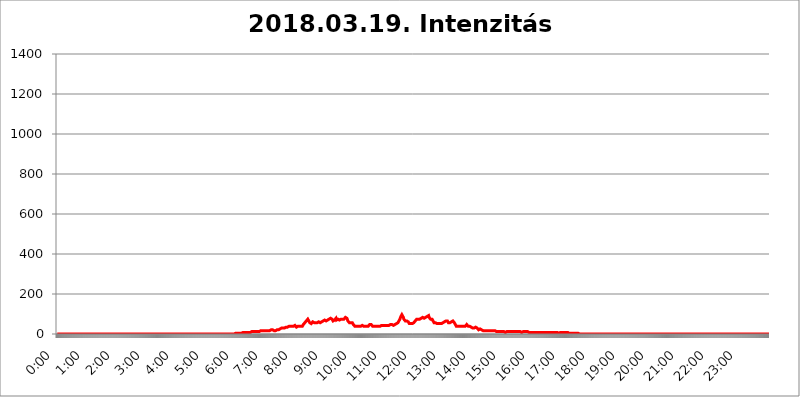
| Category | 2018.03.19. Intenzitás [W/m^2] |
|---|---|
| 0.0 | 0 |
| 0.0006944444444444445 | 0 |
| 0.001388888888888889 | 0 |
| 0.0020833333333333333 | 0 |
| 0.002777777777777778 | 0 |
| 0.003472222222222222 | 0 |
| 0.004166666666666667 | 0 |
| 0.004861111111111111 | 0 |
| 0.005555555555555556 | 0 |
| 0.0062499999999999995 | 0 |
| 0.006944444444444444 | 0 |
| 0.007638888888888889 | 0 |
| 0.008333333333333333 | 0 |
| 0.009027777777777779 | 0 |
| 0.009722222222222222 | 0 |
| 0.010416666666666666 | 0 |
| 0.011111111111111112 | 0 |
| 0.011805555555555555 | 0 |
| 0.012499999999999999 | 0 |
| 0.013194444444444444 | 0 |
| 0.013888888888888888 | 0 |
| 0.014583333333333332 | 0 |
| 0.015277777777777777 | 0 |
| 0.015972222222222224 | 0 |
| 0.016666666666666666 | 0 |
| 0.017361111111111112 | 0 |
| 0.018055555555555557 | 0 |
| 0.01875 | 0 |
| 0.019444444444444445 | 0 |
| 0.02013888888888889 | 0 |
| 0.020833333333333332 | 0 |
| 0.02152777777777778 | 0 |
| 0.022222222222222223 | 0 |
| 0.02291666666666667 | 0 |
| 0.02361111111111111 | 0 |
| 0.024305555555555556 | 0 |
| 0.024999999999999998 | 0 |
| 0.025694444444444447 | 0 |
| 0.02638888888888889 | 0 |
| 0.027083333333333334 | 0 |
| 0.027777777777777776 | 0 |
| 0.02847222222222222 | 0 |
| 0.029166666666666664 | 0 |
| 0.029861111111111113 | 0 |
| 0.030555555555555555 | 0 |
| 0.03125 | 0 |
| 0.03194444444444445 | 0 |
| 0.03263888888888889 | 0 |
| 0.03333333333333333 | 0 |
| 0.034027777777777775 | 0 |
| 0.034722222222222224 | 0 |
| 0.035416666666666666 | 0 |
| 0.036111111111111115 | 0 |
| 0.03680555555555556 | 0 |
| 0.0375 | 0 |
| 0.03819444444444444 | 0 |
| 0.03888888888888889 | 0 |
| 0.03958333333333333 | 0 |
| 0.04027777777777778 | 0 |
| 0.04097222222222222 | 0 |
| 0.041666666666666664 | 0 |
| 0.042361111111111106 | 0 |
| 0.04305555555555556 | 0 |
| 0.043750000000000004 | 0 |
| 0.044444444444444446 | 0 |
| 0.04513888888888889 | 0 |
| 0.04583333333333334 | 0 |
| 0.04652777777777778 | 0 |
| 0.04722222222222222 | 0 |
| 0.04791666666666666 | 0 |
| 0.04861111111111111 | 0 |
| 0.049305555555555554 | 0 |
| 0.049999999999999996 | 0 |
| 0.05069444444444445 | 0 |
| 0.051388888888888894 | 0 |
| 0.052083333333333336 | 0 |
| 0.05277777777777778 | 0 |
| 0.05347222222222222 | 0 |
| 0.05416666666666667 | 0 |
| 0.05486111111111111 | 0 |
| 0.05555555555555555 | 0 |
| 0.05625 | 0 |
| 0.05694444444444444 | 0 |
| 0.057638888888888885 | 0 |
| 0.05833333333333333 | 0 |
| 0.05902777777777778 | 0 |
| 0.059722222222222225 | 0 |
| 0.06041666666666667 | 0 |
| 0.061111111111111116 | 0 |
| 0.06180555555555556 | 0 |
| 0.0625 | 0 |
| 0.06319444444444444 | 0 |
| 0.06388888888888888 | 0 |
| 0.06458333333333334 | 0 |
| 0.06527777777777778 | 0 |
| 0.06597222222222222 | 0 |
| 0.06666666666666667 | 0 |
| 0.06736111111111111 | 0 |
| 0.06805555555555555 | 0 |
| 0.06874999999999999 | 0 |
| 0.06944444444444443 | 0 |
| 0.07013888888888889 | 0 |
| 0.07083333333333333 | 0 |
| 0.07152777777777779 | 0 |
| 0.07222222222222223 | 0 |
| 0.07291666666666667 | 0 |
| 0.07361111111111111 | 0 |
| 0.07430555555555556 | 0 |
| 0.075 | 0 |
| 0.07569444444444444 | 0 |
| 0.0763888888888889 | 0 |
| 0.07708333333333334 | 0 |
| 0.07777777777777778 | 0 |
| 0.07847222222222222 | 0 |
| 0.07916666666666666 | 0 |
| 0.0798611111111111 | 0 |
| 0.08055555555555556 | 0 |
| 0.08125 | 0 |
| 0.08194444444444444 | 0 |
| 0.08263888888888889 | 0 |
| 0.08333333333333333 | 0 |
| 0.08402777777777777 | 0 |
| 0.08472222222222221 | 0 |
| 0.08541666666666665 | 0 |
| 0.08611111111111112 | 0 |
| 0.08680555555555557 | 0 |
| 0.08750000000000001 | 0 |
| 0.08819444444444445 | 0 |
| 0.08888888888888889 | 0 |
| 0.08958333333333333 | 0 |
| 0.09027777777777778 | 0 |
| 0.09097222222222222 | 0 |
| 0.09166666666666667 | 0 |
| 0.09236111111111112 | 0 |
| 0.09305555555555556 | 0 |
| 0.09375 | 0 |
| 0.09444444444444444 | 0 |
| 0.09513888888888888 | 0 |
| 0.09583333333333333 | 0 |
| 0.09652777777777777 | 0 |
| 0.09722222222222222 | 0 |
| 0.09791666666666667 | 0 |
| 0.09861111111111111 | 0 |
| 0.09930555555555555 | 0 |
| 0.09999999999999999 | 0 |
| 0.10069444444444443 | 0 |
| 0.1013888888888889 | 0 |
| 0.10208333333333335 | 0 |
| 0.10277777777777779 | 0 |
| 0.10347222222222223 | 0 |
| 0.10416666666666667 | 0 |
| 0.10486111111111111 | 0 |
| 0.10555555555555556 | 0 |
| 0.10625 | 0 |
| 0.10694444444444444 | 0 |
| 0.1076388888888889 | 0 |
| 0.10833333333333334 | 0 |
| 0.10902777777777778 | 0 |
| 0.10972222222222222 | 0 |
| 0.1111111111111111 | 0 |
| 0.11180555555555556 | 0 |
| 0.11180555555555556 | 0 |
| 0.1125 | 0 |
| 0.11319444444444444 | 0 |
| 0.11388888888888889 | 0 |
| 0.11458333333333333 | 0 |
| 0.11527777777777777 | 0 |
| 0.11597222222222221 | 0 |
| 0.11666666666666665 | 0 |
| 0.1173611111111111 | 0 |
| 0.11805555555555557 | 0 |
| 0.11944444444444445 | 0 |
| 0.12013888888888889 | 0 |
| 0.12083333333333333 | 0 |
| 0.12152777777777778 | 0 |
| 0.12222222222222223 | 0 |
| 0.12291666666666667 | 0 |
| 0.12291666666666667 | 0 |
| 0.12361111111111112 | 0 |
| 0.12430555555555556 | 0 |
| 0.125 | 0 |
| 0.12569444444444444 | 0 |
| 0.12638888888888888 | 0 |
| 0.12708333333333333 | 0 |
| 0.16875 | 0 |
| 0.12847222222222224 | 0 |
| 0.12916666666666668 | 0 |
| 0.12986111111111112 | 0 |
| 0.13055555555555556 | 0 |
| 0.13125 | 0 |
| 0.13194444444444445 | 0 |
| 0.1326388888888889 | 0 |
| 0.13333333333333333 | 0 |
| 0.13402777777777777 | 0 |
| 0.13402777777777777 | 0 |
| 0.13472222222222222 | 0 |
| 0.13541666666666666 | 0 |
| 0.1361111111111111 | 0 |
| 0.13749999999999998 | 0 |
| 0.13819444444444443 | 0 |
| 0.1388888888888889 | 0 |
| 0.13958333333333334 | 0 |
| 0.14027777777777778 | 0 |
| 0.14097222222222222 | 0 |
| 0.14166666666666666 | 0 |
| 0.1423611111111111 | 0 |
| 0.14305555555555557 | 0 |
| 0.14375000000000002 | 0 |
| 0.14444444444444446 | 0 |
| 0.1451388888888889 | 0 |
| 0.1451388888888889 | 0 |
| 0.14652777777777778 | 0 |
| 0.14722222222222223 | 0 |
| 0.14791666666666667 | 0 |
| 0.1486111111111111 | 0 |
| 0.14930555555555555 | 0 |
| 0.15 | 0 |
| 0.15069444444444444 | 0 |
| 0.15138888888888888 | 0 |
| 0.15208333333333332 | 0 |
| 0.15277777777777776 | 0 |
| 0.15347222222222223 | 0 |
| 0.15416666666666667 | 0 |
| 0.15486111111111112 | 0 |
| 0.15555555555555556 | 0 |
| 0.15625 | 0 |
| 0.15694444444444444 | 0 |
| 0.15763888888888888 | 0 |
| 0.15833333333333333 | 0 |
| 0.15902777777777777 | 0 |
| 0.15972222222222224 | 0 |
| 0.16041666666666668 | 0 |
| 0.16111111111111112 | 0 |
| 0.16180555555555556 | 0 |
| 0.1625 | 0 |
| 0.16319444444444445 | 0 |
| 0.1638888888888889 | 0 |
| 0.16458333333333333 | 0 |
| 0.16527777777777777 | 0 |
| 0.16597222222222222 | 0 |
| 0.16666666666666666 | 0 |
| 0.1673611111111111 | 0 |
| 0.16805555555555554 | 0 |
| 0.16874999999999998 | 0 |
| 0.16944444444444443 | 0 |
| 0.17013888888888887 | 0 |
| 0.1708333333333333 | 0 |
| 0.17152777777777775 | 0 |
| 0.17222222222222225 | 0 |
| 0.1729166666666667 | 0 |
| 0.17361111111111113 | 0 |
| 0.17430555555555557 | 0 |
| 0.17500000000000002 | 0 |
| 0.17569444444444446 | 0 |
| 0.1763888888888889 | 0 |
| 0.17708333333333334 | 0 |
| 0.17777777777777778 | 0 |
| 0.17847222222222223 | 0 |
| 0.17916666666666667 | 0 |
| 0.1798611111111111 | 0 |
| 0.18055555555555555 | 0 |
| 0.18125 | 0 |
| 0.18194444444444444 | 0 |
| 0.1826388888888889 | 0 |
| 0.18333333333333335 | 0 |
| 0.1840277777777778 | 0 |
| 0.18472222222222223 | 0 |
| 0.18541666666666667 | 0 |
| 0.18611111111111112 | 0 |
| 0.18680555555555556 | 0 |
| 0.1875 | 0 |
| 0.18819444444444444 | 0 |
| 0.18888888888888888 | 0 |
| 0.18958333333333333 | 0 |
| 0.19027777777777777 | 0 |
| 0.1909722222222222 | 0 |
| 0.19166666666666665 | 0 |
| 0.19236111111111112 | 0 |
| 0.19305555555555554 | 0 |
| 0.19375 | 0 |
| 0.19444444444444445 | 0 |
| 0.1951388888888889 | 0 |
| 0.19583333333333333 | 0 |
| 0.19652777777777777 | 0 |
| 0.19722222222222222 | 0 |
| 0.19791666666666666 | 0 |
| 0.1986111111111111 | 0 |
| 0.19930555555555554 | 0 |
| 0.19999999999999998 | 0 |
| 0.20069444444444443 | 0 |
| 0.20138888888888887 | 0 |
| 0.2020833333333333 | 0 |
| 0.2027777777777778 | 0 |
| 0.2034722222222222 | 0 |
| 0.2041666666666667 | 0 |
| 0.20486111111111113 | 0 |
| 0.20555555555555557 | 0 |
| 0.20625000000000002 | 0 |
| 0.20694444444444446 | 0 |
| 0.2076388888888889 | 0 |
| 0.20833333333333334 | 0 |
| 0.20902777777777778 | 0 |
| 0.20972222222222223 | 0 |
| 0.21041666666666667 | 0 |
| 0.2111111111111111 | 0 |
| 0.21180555555555555 | 0 |
| 0.2125 | 0 |
| 0.21319444444444444 | 0 |
| 0.2138888888888889 | 0 |
| 0.21458333333333335 | 0 |
| 0.2152777777777778 | 0 |
| 0.21597222222222223 | 0 |
| 0.21666666666666667 | 0 |
| 0.21736111111111112 | 0 |
| 0.21805555555555556 | 0 |
| 0.21875 | 0 |
| 0.21944444444444444 | 0 |
| 0.22013888888888888 | 0 |
| 0.22083333333333333 | 0 |
| 0.22152777777777777 | 0 |
| 0.2222222222222222 | 0 |
| 0.22291666666666665 | 0 |
| 0.2236111111111111 | 0 |
| 0.22430555555555556 | 0 |
| 0.225 | 0 |
| 0.22569444444444445 | 0 |
| 0.2263888888888889 | 0 |
| 0.22708333333333333 | 0 |
| 0.22777777777777777 | 0 |
| 0.22847222222222222 | 0 |
| 0.22916666666666666 | 0 |
| 0.2298611111111111 | 0 |
| 0.23055555555555554 | 0 |
| 0.23124999999999998 | 0 |
| 0.23194444444444443 | 0 |
| 0.23263888888888887 | 0 |
| 0.2333333333333333 | 0 |
| 0.2340277777777778 | 0 |
| 0.2347222222222222 | 0 |
| 0.2354166666666667 | 0 |
| 0.23611111111111113 | 0 |
| 0.23680555555555557 | 0 |
| 0.23750000000000002 | 0 |
| 0.23819444444444446 | 0 |
| 0.2388888888888889 | 0 |
| 0.23958333333333334 | 0 |
| 0.24027777777777778 | 0 |
| 0.24097222222222223 | 0 |
| 0.24166666666666667 | 0 |
| 0.2423611111111111 | 0 |
| 0.24305555555555555 | 0 |
| 0.24375 | 0 |
| 0.24444444444444446 | 0 |
| 0.24513888888888888 | 0 |
| 0.24583333333333335 | 0 |
| 0.2465277777777778 | 0 |
| 0.24722222222222223 | 0 |
| 0.24791666666666667 | 0 |
| 0.24861111111111112 | 3.525 |
| 0.24930555555555556 | 3.525 |
| 0.25 | 3.525 |
| 0.25069444444444444 | 3.525 |
| 0.2513888888888889 | 3.525 |
| 0.2520833333333333 | 3.525 |
| 0.25277777777777777 | 3.525 |
| 0.2534722222222222 | 3.525 |
| 0.25416666666666665 | 3.525 |
| 0.2548611111111111 | 3.525 |
| 0.2555555555555556 | 3.525 |
| 0.25625000000000003 | 3.525 |
| 0.2569444444444445 | 3.525 |
| 0.2576388888888889 | 3.525 |
| 0.25833333333333336 | 3.525 |
| 0.2590277777777778 | 3.525 |
| 0.25972222222222224 | 3.525 |
| 0.2604166666666667 | 7.887 |
| 0.2611111111111111 | 7.887 |
| 0.26180555555555557 | 7.887 |
| 0.2625 | 7.887 |
| 0.26319444444444445 | 7.887 |
| 0.2638888888888889 | 7.887 |
| 0.26458333333333334 | 7.887 |
| 0.2652777777777778 | 7.887 |
| 0.2659722222222222 | 7.887 |
| 0.26666666666666666 | 7.887 |
| 0.2673611111111111 | 7.887 |
| 0.26805555555555555 | 7.887 |
| 0.26875 | 7.887 |
| 0.26944444444444443 | 12.257 |
| 0.2701388888888889 | 7.887 |
| 0.2708333333333333 | 7.887 |
| 0.27152777777777776 | 12.257 |
| 0.2722222222222222 | 12.257 |
| 0.27291666666666664 | 12.257 |
| 0.2736111111111111 | 12.257 |
| 0.2743055555555555 | 12.257 |
| 0.27499999999999997 | 12.257 |
| 0.27569444444444446 | 12.257 |
| 0.27638888888888885 | 12.257 |
| 0.27708333333333335 | 12.257 |
| 0.2777777777777778 | 12.257 |
| 0.27847222222222223 | 12.257 |
| 0.2791666666666667 | 12.257 |
| 0.2798611111111111 | 12.257 |
| 0.28055555555555556 | 12.257 |
| 0.28125 | 12.257 |
| 0.28194444444444444 | 12.257 |
| 0.2826388888888889 | 12.257 |
| 0.2833333333333333 | 12.257 |
| 0.28402777777777777 | 12.257 |
| 0.2847222222222222 | 16.636 |
| 0.28541666666666665 | 16.636 |
| 0.28611111111111115 | 16.636 |
| 0.28680555555555554 | 16.636 |
| 0.28750000000000003 | 16.636 |
| 0.2881944444444445 | 16.636 |
| 0.2888888888888889 | 16.636 |
| 0.28958333333333336 | 16.636 |
| 0.2902777777777778 | 16.636 |
| 0.29097222222222224 | 16.636 |
| 0.2916666666666667 | 16.636 |
| 0.2923611111111111 | 16.636 |
| 0.29305555555555557 | 16.636 |
| 0.29375 | 16.636 |
| 0.29444444444444445 | 16.636 |
| 0.2951388888888889 | 16.636 |
| 0.29583333333333334 | 16.636 |
| 0.2965277777777778 | 16.636 |
| 0.2972222222222222 | 21.024 |
| 0.29791666666666666 | 16.636 |
| 0.2986111111111111 | 21.024 |
| 0.29930555555555555 | 21.024 |
| 0.3 | 21.024 |
| 0.30069444444444443 | 21.024 |
| 0.3013888888888889 | 21.024 |
| 0.3020833333333333 | 21.024 |
| 0.30277777777777776 | 21.024 |
| 0.3034722222222222 | 21.024 |
| 0.30416666666666664 | 16.636 |
| 0.3048611111111111 | 16.636 |
| 0.3055555555555555 | 16.636 |
| 0.30624999999999997 | 16.636 |
| 0.3069444444444444 | 21.024 |
| 0.3076388888888889 | 21.024 |
| 0.30833333333333335 | 21.024 |
| 0.3090277777777778 | 21.024 |
| 0.30972222222222223 | 21.024 |
| 0.3104166666666667 | 21.024 |
| 0.3111111111111111 | 25.419 |
| 0.31180555555555556 | 25.419 |
| 0.3125 | 25.419 |
| 0.31319444444444444 | 29.823 |
| 0.3138888888888889 | 29.823 |
| 0.3145833333333333 | 29.823 |
| 0.31527777777777777 | 29.823 |
| 0.3159722222222222 | 29.823 |
| 0.31666666666666665 | 29.823 |
| 0.31736111111111115 | 29.823 |
| 0.31805555555555554 | 29.823 |
| 0.31875000000000003 | 29.823 |
| 0.3194444444444445 | 29.823 |
| 0.3201388888888889 | 29.823 |
| 0.32083333333333336 | 34.234 |
| 0.3215277777777778 | 34.234 |
| 0.32222222222222224 | 34.234 |
| 0.3229166666666667 | 34.234 |
| 0.3236111111111111 | 34.234 |
| 0.32430555555555557 | 34.234 |
| 0.325 | 38.653 |
| 0.32569444444444445 | 38.653 |
| 0.3263888888888889 | 38.653 |
| 0.32708333333333334 | 38.653 |
| 0.3277777777777778 | 38.653 |
| 0.3284722222222222 | 38.653 |
| 0.32916666666666666 | 38.653 |
| 0.3298611111111111 | 38.653 |
| 0.33055555555555555 | 38.653 |
| 0.33125 | 38.653 |
| 0.33194444444444443 | 38.653 |
| 0.3326388888888889 | 38.653 |
| 0.3333333333333333 | 43.079 |
| 0.3340277777777778 | 43.079 |
| 0.3347222222222222 | 43.079 |
| 0.3354166666666667 | 34.234 |
| 0.3361111111111111 | 34.234 |
| 0.3368055555555556 | 38.653 |
| 0.33749999999999997 | 38.653 |
| 0.33819444444444446 | 38.653 |
| 0.33888888888888885 | 38.653 |
| 0.33958333333333335 | 38.653 |
| 0.34027777777777773 | 38.653 |
| 0.34097222222222223 | 38.653 |
| 0.3416666666666666 | 38.653 |
| 0.3423611111111111 | 38.653 |
| 0.3430555555555555 | 38.653 |
| 0.34375 | 38.653 |
| 0.3444444444444445 | 43.079 |
| 0.3451388888888889 | 47.511 |
| 0.3458333333333334 | 47.511 |
| 0.34652777777777777 | 51.951 |
| 0.34722222222222227 | 56.398 |
| 0.34791666666666665 | 56.398 |
| 0.34861111111111115 | 60.85 |
| 0.34930555555555554 | 65.31 |
| 0.35000000000000003 | 65.31 |
| 0.3506944444444444 | 69.775 |
| 0.3513888888888889 | 74.246 |
| 0.3520833333333333 | 74.246 |
| 0.3527777777777778 | 65.31 |
| 0.3534722222222222 | 60.85 |
| 0.3541666666666667 | 56.398 |
| 0.3548611111111111 | 56.398 |
| 0.35555555555555557 | 51.951 |
| 0.35625 | 51.951 |
| 0.35694444444444445 | 56.398 |
| 0.3576388888888889 | 56.398 |
| 0.35833333333333334 | 60.85 |
| 0.3590277777777778 | 56.398 |
| 0.3597222222222222 | 60.85 |
| 0.36041666666666666 | 56.398 |
| 0.3611111111111111 | 56.398 |
| 0.36180555555555555 | 56.398 |
| 0.3625 | 56.398 |
| 0.36319444444444443 | 56.398 |
| 0.3638888888888889 | 56.398 |
| 0.3645833333333333 | 56.398 |
| 0.3652777777777778 | 56.398 |
| 0.3659722222222222 | 60.85 |
| 0.3666666666666667 | 60.85 |
| 0.3673611111111111 | 56.398 |
| 0.3680555555555556 | 56.398 |
| 0.36874999999999997 | 56.398 |
| 0.36944444444444446 | 60.85 |
| 0.37013888888888885 | 60.85 |
| 0.37083333333333335 | 60.85 |
| 0.37152777777777773 | 60.85 |
| 0.37222222222222223 | 65.31 |
| 0.3729166666666666 | 65.31 |
| 0.3736111111111111 | 65.31 |
| 0.3743055555555555 | 69.775 |
| 0.375 | 69.775 |
| 0.3756944444444445 | 65.31 |
| 0.3763888888888889 | 65.31 |
| 0.3770833333333334 | 65.31 |
| 0.37777777777777777 | 69.775 |
| 0.37847222222222227 | 69.775 |
| 0.37916666666666665 | 69.775 |
| 0.37986111111111115 | 74.246 |
| 0.38055555555555554 | 74.246 |
| 0.38125000000000003 | 74.246 |
| 0.3819444444444444 | 74.246 |
| 0.3826388888888889 | 74.246 |
| 0.3833333333333333 | 78.722 |
| 0.3840277777777778 | 74.246 |
| 0.3847222222222222 | 74.246 |
| 0.3854166666666667 | 74.246 |
| 0.3861111111111111 | 69.775 |
| 0.38680555555555557 | 65.31 |
| 0.3875 | 65.31 |
| 0.38819444444444445 | 65.31 |
| 0.3888888888888889 | 69.775 |
| 0.38958333333333334 | 74.246 |
| 0.3902777777777778 | 74.246 |
| 0.3909722222222222 | 78.722 |
| 0.39166666666666666 | 69.775 |
| 0.3923611111111111 | 69.775 |
| 0.39305555555555555 | 69.775 |
| 0.39375 | 74.246 |
| 0.39444444444444443 | 69.775 |
| 0.3951388888888889 | 69.775 |
| 0.3958333333333333 | 69.775 |
| 0.3965277777777778 | 69.775 |
| 0.3972222222222222 | 74.246 |
| 0.3979166666666667 | 74.246 |
| 0.3986111111111111 | 74.246 |
| 0.3993055555555556 | 74.246 |
| 0.39999999999999997 | 74.246 |
| 0.40069444444444446 | 74.246 |
| 0.40138888888888885 | 74.246 |
| 0.40208333333333335 | 74.246 |
| 0.40277777777777773 | 74.246 |
| 0.40347222222222223 | 78.722 |
| 0.4041666666666666 | 83.205 |
| 0.4048611111111111 | 83.205 |
| 0.4055555555555555 | 83.205 |
| 0.40625 | 78.722 |
| 0.4069444444444445 | 74.246 |
| 0.4076388888888889 | 65.31 |
| 0.4083333333333334 | 60.85 |
| 0.40902777777777777 | 60.85 |
| 0.40972222222222227 | 56.398 |
| 0.41041666666666665 | 56.398 |
| 0.41111111111111115 | 56.398 |
| 0.41180555555555554 | 56.398 |
| 0.41250000000000003 | 56.398 |
| 0.4131944444444444 | 56.398 |
| 0.4138888888888889 | 56.398 |
| 0.4145833333333333 | 51.951 |
| 0.4152777777777778 | 47.511 |
| 0.4159722222222222 | 47.511 |
| 0.4166666666666667 | 43.079 |
| 0.4173611111111111 | 38.653 |
| 0.41805555555555557 | 38.653 |
| 0.41875 | 38.653 |
| 0.41944444444444445 | 38.653 |
| 0.4201388888888889 | 38.653 |
| 0.42083333333333334 | 38.653 |
| 0.4215277777777778 | 38.653 |
| 0.4222222222222222 | 38.653 |
| 0.42291666666666666 | 38.653 |
| 0.4236111111111111 | 38.653 |
| 0.42430555555555555 | 38.653 |
| 0.425 | 38.653 |
| 0.42569444444444443 | 38.653 |
| 0.4263888888888889 | 43.079 |
| 0.4270833333333333 | 43.079 |
| 0.4277777777777778 | 43.079 |
| 0.4284722222222222 | 43.079 |
| 0.4291666666666667 | 43.079 |
| 0.4298611111111111 | 38.653 |
| 0.4305555555555556 | 38.653 |
| 0.43124999999999997 | 38.653 |
| 0.43194444444444446 | 38.653 |
| 0.43263888888888885 | 34.234 |
| 0.43333333333333335 | 34.234 |
| 0.43402777777777773 | 38.653 |
| 0.43472222222222223 | 38.653 |
| 0.4354166666666666 | 38.653 |
| 0.4361111111111111 | 38.653 |
| 0.4368055555555555 | 43.079 |
| 0.4375 | 43.079 |
| 0.4381944444444445 | 47.511 |
| 0.4388888888888889 | 47.511 |
| 0.4395833333333334 | 47.511 |
| 0.44027777777777777 | 47.511 |
| 0.44097222222222227 | 43.079 |
| 0.44166666666666665 | 43.079 |
| 0.44236111111111115 | 38.653 |
| 0.44305555555555554 | 38.653 |
| 0.44375000000000003 | 38.653 |
| 0.4444444444444444 | 38.653 |
| 0.4451388888888889 | 34.234 |
| 0.4458333333333333 | 34.234 |
| 0.4465277777777778 | 38.653 |
| 0.4472222222222222 | 38.653 |
| 0.4479166666666667 | 38.653 |
| 0.4486111111111111 | 38.653 |
| 0.44930555555555557 | 38.653 |
| 0.45 | 38.653 |
| 0.45069444444444445 | 38.653 |
| 0.4513888888888889 | 38.653 |
| 0.45208333333333334 | 38.653 |
| 0.4527777777777778 | 38.653 |
| 0.4534722222222222 | 43.079 |
| 0.45416666666666666 | 43.079 |
| 0.4548611111111111 | 43.079 |
| 0.45555555555555555 | 43.079 |
| 0.45625 | 43.079 |
| 0.45694444444444443 | 43.079 |
| 0.4576388888888889 | 43.079 |
| 0.4583333333333333 | 43.079 |
| 0.4590277777777778 | 43.079 |
| 0.4597222222222222 | 43.079 |
| 0.4604166666666667 | 43.079 |
| 0.4611111111111111 | 43.079 |
| 0.4618055555555556 | 43.079 |
| 0.46249999999999997 | 43.079 |
| 0.46319444444444446 | 43.079 |
| 0.46388888888888885 | 43.079 |
| 0.46458333333333335 | 43.079 |
| 0.46527777777777773 | 43.079 |
| 0.46597222222222223 | 43.079 |
| 0.4666666666666666 | 47.511 |
| 0.4673611111111111 | 47.511 |
| 0.4680555555555555 | 47.511 |
| 0.46875 | 47.511 |
| 0.4694444444444445 | 47.511 |
| 0.4701388888888889 | 43.079 |
| 0.4708333333333334 | 43.079 |
| 0.47152777777777777 | 43.079 |
| 0.47222222222222227 | 47.511 |
| 0.47291666666666665 | 47.511 |
| 0.47361111111111115 | 47.511 |
| 0.47430555555555554 | 47.511 |
| 0.47500000000000003 | 47.511 |
| 0.4756944444444444 | 51.951 |
| 0.4763888888888889 | 51.951 |
| 0.4770833333333333 | 56.398 |
| 0.4777777777777778 | 56.398 |
| 0.4784722222222222 | 60.85 |
| 0.4791666666666667 | 65.31 |
| 0.4798611111111111 | 69.775 |
| 0.48055555555555557 | 74.246 |
| 0.48125 | 78.722 |
| 0.48194444444444445 | 87.692 |
| 0.4826388888888889 | 92.184 |
| 0.48333333333333334 | 96.682 |
| 0.4840277777777778 | 96.682 |
| 0.4847222222222222 | 92.184 |
| 0.48541666666666666 | 83.205 |
| 0.4861111111111111 | 74.246 |
| 0.48680555555555555 | 74.246 |
| 0.4875 | 69.775 |
| 0.48819444444444443 | 65.31 |
| 0.4888888888888889 | 65.31 |
| 0.4895833333333333 | 65.31 |
| 0.4902777777777778 | 65.31 |
| 0.4909722222222222 | 65.31 |
| 0.4916666666666667 | 60.85 |
| 0.4923611111111111 | 60.85 |
| 0.4930555555555556 | 56.398 |
| 0.49374999999999997 | 51.951 |
| 0.49444444444444446 | 51.951 |
| 0.49513888888888885 | 51.951 |
| 0.49583333333333335 | 51.951 |
| 0.49652777777777773 | 47.511 |
| 0.49722222222222223 | 51.951 |
| 0.4979166666666666 | 51.951 |
| 0.4986111111111111 | 51.951 |
| 0.4993055555555555 | 56.398 |
| 0.5 | 56.398 |
| 0.5006944444444444 | 56.398 |
| 0.5013888888888889 | 60.85 |
| 0.5020833333333333 | 65.31 |
| 0.5027777777777778 | 65.31 |
| 0.5034722222222222 | 69.775 |
| 0.5041666666666667 | 74.246 |
| 0.5048611111111111 | 74.246 |
| 0.5055555555555555 | 74.246 |
| 0.50625 | 74.246 |
| 0.5069444444444444 | 74.246 |
| 0.5076388888888889 | 74.246 |
| 0.5083333333333333 | 74.246 |
| 0.5090277777777777 | 74.246 |
| 0.5097222222222222 | 74.246 |
| 0.5104166666666666 | 78.722 |
| 0.5111111111111112 | 78.722 |
| 0.5118055555555555 | 83.205 |
| 0.5125000000000001 | 83.205 |
| 0.5131944444444444 | 78.722 |
| 0.513888888888889 | 78.722 |
| 0.5145833333333333 | 78.722 |
| 0.5152777777777778 | 78.722 |
| 0.5159722222222222 | 83.205 |
| 0.5166666666666667 | 83.205 |
| 0.517361111111111 | 87.692 |
| 0.5180555555555556 | 87.692 |
| 0.5187499999999999 | 87.692 |
| 0.5194444444444445 | 92.184 |
| 0.5201388888888888 | 92.184 |
| 0.5208333333333334 | 92.184 |
| 0.5215277777777778 | 83.205 |
| 0.5222222222222223 | 78.722 |
| 0.5229166666666667 | 78.722 |
| 0.5236111111111111 | 74.246 |
| 0.5243055555555556 | 74.246 |
| 0.525 | 74.246 |
| 0.5256944444444445 | 74.246 |
| 0.5263888888888889 | 69.775 |
| 0.5270833333333333 | 65.31 |
| 0.5277777777777778 | 60.85 |
| 0.5284722222222222 | 56.398 |
| 0.5291666666666667 | 56.398 |
| 0.5298611111111111 | 56.398 |
| 0.5305555555555556 | 56.398 |
| 0.53125 | 51.951 |
| 0.5319444444444444 | 51.951 |
| 0.5326388888888889 | 51.951 |
| 0.5333333333333333 | 51.951 |
| 0.5340277777777778 | 51.951 |
| 0.5347222222222222 | 51.951 |
| 0.5354166666666667 | 51.951 |
| 0.5361111111111111 | 51.951 |
| 0.5368055555555555 | 51.951 |
| 0.5375 | 51.951 |
| 0.5381944444444444 | 51.951 |
| 0.5388888888888889 | 51.951 |
| 0.5395833333333333 | 51.951 |
| 0.5402777777777777 | 56.398 |
| 0.5409722222222222 | 56.398 |
| 0.5416666666666666 | 56.398 |
| 0.5423611111111112 | 60.85 |
| 0.5430555555555555 | 60.85 |
| 0.5437500000000001 | 60.85 |
| 0.5444444444444444 | 65.31 |
| 0.545138888888889 | 65.31 |
| 0.5458333333333333 | 65.31 |
| 0.5465277777777778 | 65.31 |
| 0.5472222222222222 | 65.31 |
| 0.5479166666666667 | 60.85 |
| 0.548611111111111 | 56.398 |
| 0.5493055555555556 | 56.398 |
| 0.5499999999999999 | 56.398 |
| 0.5506944444444445 | 56.398 |
| 0.5513888888888888 | 56.398 |
| 0.5520833333333334 | 56.398 |
| 0.5527777777777778 | 60.85 |
| 0.5534722222222223 | 65.31 |
| 0.5541666666666667 | 65.31 |
| 0.5548611111111111 | 65.31 |
| 0.5555555555555556 | 65.31 |
| 0.55625 | 60.85 |
| 0.5569444444444445 | 56.398 |
| 0.5576388888888889 | 51.951 |
| 0.5583333333333333 | 47.511 |
| 0.5590277777777778 | 43.079 |
| 0.5597222222222222 | 38.653 |
| 0.5604166666666667 | 38.653 |
| 0.5611111111111111 | 38.653 |
| 0.5618055555555556 | 38.653 |
| 0.5625 | 38.653 |
| 0.5631944444444444 | 38.653 |
| 0.5638888888888889 | 38.653 |
| 0.5645833333333333 | 38.653 |
| 0.5652777777777778 | 38.653 |
| 0.5659722222222222 | 38.653 |
| 0.5666666666666667 | 38.653 |
| 0.5673611111111111 | 38.653 |
| 0.5680555555555555 | 38.653 |
| 0.56875 | 38.653 |
| 0.5694444444444444 | 38.653 |
| 0.5701388888888889 | 38.653 |
| 0.5708333333333333 | 38.653 |
| 0.5715277777777777 | 38.653 |
| 0.5722222222222222 | 38.653 |
| 0.5729166666666666 | 43.079 |
| 0.5736111111111112 | 43.079 |
| 0.5743055555555555 | 47.511 |
| 0.5750000000000001 | 43.079 |
| 0.5756944444444444 | 43.079 |
| 0.576388888888889 | 38.653 |
| 0.5770833333333333 | 38.653 |
| 0.5777777777777778 | 38.653 |
| 0.5784722222222222 | 38.653 |
| 0.5791666666666667 | 38.653 |
| 0.579861111111111 | 34.234 |
| 0.5805555555555556 | 34.234 |
| 0.5812499999999999 | 34.234 |
| 0.5819444444444445 | 34.234 |
| 0.5826388888888888 | 29.823 |
| 0.5833333333333334 | 29.823 |
| 0.5840277777777778 | 29.823 |
| 0.5847222222222223 | 29.823 |
| 0.5854166666666667 | 29.823 |
| 0.5861111111111111 | 34.234 |
| 0.5868055555555556 | 34.234 |
| 0.5875 | 34.234 |
| 0.5881944444444445 | 29.823 |
| 0.5888888888888889 | 29.823 |
| 0.5895833333333333 | 25.419 |
| 0.5902777777777778 | 25.419 |
| 0.5909722222222222 | 21.024 |
| 0.5916666666666667 | 21.024 |
| 0.5923611111111111 | 21.024 |
| 0.5930555555555556 | 25.419 |
| 0.59375 | 21.024 |
| 0.5944444444444444 | 21.024 |
| 0.5951388888888889 | 21.024 |
| 0.5958333333333333 | 21.024 |
| 0.5965277777777778 | 21.024 |
| 0.5972222222222222 | 16.636 |
| 0.5979166666666667 | 16.636 |
| 0.5986111111111111 | 16.636 |
| 0.5993055555555555 | 16.636 |
| 0.6 | 16.636 |
| 0.6006944444444444 | 16.636 |
| 0.6013888888888889 | 16.636 |
| 0.6020833333333333 | 16.636 |
| 0.6027777777777777 | 16.636 |
| 0.6034722222222222 | 16.636 |
| 0.6041666666666666 | 16.636 |
| 0.6048611111111112 | 16.636 |
| 0.6055555555555555 | 16.636 |
| 0.6062500000000001 | 16.636 |
| 0.6069444444444444 | 16.636 |
| 0.607638888888889 | 16.636 |
| 0.6083333333333333 | 16.636 |
| 0.6090277777777778 | 16.636 |
| 0.6097222222222222 | 16.636 |
| 0.6104166666666667 | 16.636 |
| 0.611111111111111 | 16.636 |
| 0.6118055555555556 | 16.636 |
| 0.6124999999999999 | 16.636 |
| 0.6131944444444445 | 16.636 |
| 0.6138888888888888 | 16.636 |
| 0.6145833333333334 | 16.636 |
| 0.6152777777777778 | 16.636 |
| 0.6159722222222223 | 12.257 |
| 0.6166666666666667 | 12.257 |
| 0.6173611111111111 | 12.257 |
| 0.6180555555555556 | 12.257 |
| 0.61875 | 16.636 |
| 0.6194444444444445 | 16.636 |
| 0.6201388888888889 | 12.257 |
| 0.6208333333333333 | 12.257 |
| 0.6215277777777778 | 12.257 |
| 0.6222222222222222 | 12.257 |
| 0.6229166666666667 | 12.257 |
| 0.6236111111111111 | 12.257 |
| 0.6243055555555556 | 12.257 |
| 0.625 | 12.257 |
| 0.6256944444444444 | 12.257 |
| 0.6263888888888889 | 12.257 |
| 0.6270833333333333 | 7.887 |
| 0.6277777777777778 | 7.887 |
| 0.6284722222222222 | 7.887 |
| 0.6291666666666667 | 7.887 |
| 0.6298611111111111 | 12.257 |
| 0.6305555555555555 | 12.257 |
| 0.63125 | 12.257 |
| 0.6319444444444444 | 12.257 |
| 0.6326388888888889 | 12.257 |
| 0.6333333333333333 | 12.257 |
| 0.6340277777777777 | 12.257 |
| 0.6347222222222222 | 12.257 |
| 0.6354166666666666 | 12.257 |
| 0.6361111111111112 | 12.257 |
| 0.6368055555555555 | 12.257 |
| 0.6375000000000001 | 12.257 |
| 0.6381944444444444 | 12.257 |
| 0.638888888888889 | 12.257 |
| 0.6395833333333333 | 12.257 |
| 0.6402777777777778 | 7.887 |
| 0.6409722222222222 | 12.257 |
| 0.6416666666666667 | 12.257 |
| 0.642361111111111 | 12.257 |
| 0.6430555555555556 | 12.257 |
| 0.6437499999999999 | 12.257 |
| 0.6444444444444445 | 12.257 |
| 0.6451388888888888 | 12.257 |
| 0.6458333333333334 | 12.257 |
| 0.6465277777777778 | 12.257 |
| 0.6472222222222223 | 12.257 |
| 0.6479166666666667 | 12.257 |
| 0.6486111111111111 | 7.887 |
| 0.6493055555555556 | 12.257 |
| 0.65 | 7.887 |
| 0.6506944444444445 | 7.887 |
| 0.6513888888888889 | 7.887 |
| 0.6520833333333333 | 7.887 |
| 0.6527777777777778 | 7.887 |
| 0.6534722222222222 | 12.257 |
| 0.6541666666666667 | 12.257 |
| 0.6548611111111111 | 12.257 |
| 0.6555555555555556 | 12.257 |
| 0.65625 | 12.257 |
| 0.6569444444444444 | 12.257 |
| 0.6576388888888889 | 12.257 |
| 0.6583333333333333 | 12.257 |
| 0.6590277777777778 | 12.257 |
| 0.6597222222222222 | 12.257 |
| 0.6604166666666667 | 12.257 |
| 0.6611111111111111 | 12.257 |
| 0.6618055555555555 | 7.887 |
| 0.6625 | 7.887 |
| 0.6631944444444444 | 7.887 |
| 0.6638888888888889 | 7.887 |
| 0.6645833333333333 | 7.887 |
| 0.6652777777777777 | 7.887 |
| 0.6659722222222222 | 7.887 |
| 0.6666666666666666 | 7.887 |
| 0.6673611111111111 | 7.887 |
| 0.6680555555555556 | 7.887 |
| 0.6687500000000001 | 7.887 |
| 0.6694444444444444 | 7.887 |
| 0.6701388888888888 | 7.887 |
| 0.6708333333333334 | 7.887 |
| 0.6715277777777778 | 7.887 |
| 0.6722222222222222 | 7.887 |
| 0.6729166666666666 | 7.887 |
| 0.6736111111111112 | 7.887 |
| 0.6743055555555556 | 7.887 |
| 0.6749999999999999 | 7.887 |
| 0.6756944444444444 | 7.887 |
| 0.6763888888888889 | 7.887 |
| 0.6770833333333334 | 7.887 |
| 0.6777777777777777 | 7.887 |
| 0.6784722222222223 | 7.887 |
| 0.6791666666666667 | 7.887 |
| 0.6798611111111111 | 7.887 |
| 0.6805555555555555 | 7.887 |
| 0.68125 | 7.887 |
| 0.6819444444444445 | 7.887 |
| 0.6826388888888889 | 7.887 |
| 0.6833333333333332 | 7.887 |
| 0.6840277777777778 | 7.887 |
| 0.6847222222222222 | 7.887 |
| 0.6854166666666667 | 7.887 |
| 0.686111111111111 | 7.887 |
| 0.6868055555555556 | 7.887 |
| 0.6875 | 7.887 |
| 0.6881944444444444 | 7.887 |
| 0.688888888888889 | 7.887 |
| 0.6895833333333333 | 7.887 |
| 0.6902777777777778 | 7.887 |
| 0.6909722222222222 | 7.887 |
| 0.6916666666666668 | 7.887 |
| 0.6923611111111111 | 7.887 |
| 0.6930555555555555 | 7.887 |
| 0.69375 | 7.887 |
| 0.6944444444444445 | 7.887 |
| 0.6951388888888889 | 7.887 |
| 0.6958333333333333 | 7.887 |
| 0.6965277777777777 | 7.887 |
| 0.6972222222222223 | 7.887 |
| 0.6979166666666666 | 7.887 |
| 0.6986111111111111 | 7.887 |
| 0.6993055555555556 | 7.887 |
| 0.7000000000000001 | 7.887 |
| 0.7006944444444444 | 7.887 |
| 0.7013888888888888 | 7.887 |
| 0.7020833333333334 | 7.887 |
| 0.7027777777777778 | 3.525 |
| 0.7034722222222222 | 3.525 |
| 0.7041666666666666 | 3.525 |
| 0.7048611111111112 | 3.525 |
| 0.7055555555555556 | 7.887 |
| 0.7062499999999999 | 7.887 |
| 0.7069444444444444 | 7.887 |
| 0.7076388888888889 | 7.887 |
| 0.7083333333333334 | 7.887 |
| 0.7090277777777777 | 7.887 |
| 0.7097222222222223 | 7.887 |
| 0.7104166666666667 | 7.887 |
| 0.7111111111111111 | 7.887 |
| 0.7118055555555555 | 7.887 |
| 0.7125 | 7.887 |
| 0.7131944444444445 | 7.887 |
| 0.7138888888888889 | 7.887 |
| 0.7145833333333332 | 7.887 |
| 0.7152777777777778 | 7.887 |
| 0.7159722222222222 | 7.887 |
| 0.7166666666666667 | 3.525 |
| 0.717361111111111 | 3.525 |
| 0.7180555555555556 | 3.525 |
| 0.71875 | 3.525 |
| 0.7194444444444444 | 3.525 |
| 0.720138888888889 | 3.525 |
| 0.7208333333333333 | 3.525 |
| 0.7215277777777778 | 3.525 |
| 0.7222222222222222 | 3.525 |
| 0.7229166666666668 | 3.525 |
| 0.7236111111111111 | 3.525 |
| 0.7243055555555555 | 3.525 |
| 0.725 | 3.525 |
| 0.7256944444444445 | 3.525 |
| 0.7263888888888889 | 3.525 |
| 0.7270833333333333 | 3.525 |
| 0.7277777777777777 | 3.525 |
| 0.7284722222222223 | 3.525 |
| 0.7291666666666666 | 3.525 |
| 0.7298611111111111 | 3.525 |
| 0.7305555555555556 | 3.525 |
| 0.7312500000000001 | 0 |
| 0.7319444444444444 | 0 |
| 0.7326388888888888 | 0 |
| 0.7333333333333334 | 0 |
| 0.7340277777777778 | 0 |
| 0.7347222222222222 | 0 |
| 0.7354166666666666 | 0 |
| 0.7361111111111112 | 0 |
| 0.7368055555555556 | 0 |
| 0.7374999999999999 | 0 |
| 0.7381944444444444 | 0 |
| 0.7388888888888889 | 0 |
| 0.7395833333333334 | 0 |
| 0.7402777777777777 | 0 |
| 0.7409722222222223 | 0 |
| 0.7416666666666667 | 0 |
| 0.7423611111111111 | 0 |
| 0.7430555555555555 | 0 |
| 0.74375 | 0 |
| 0.7444444444444445 | 0 |
| 0.7451388888888889 | 0 |
| 0.7458333333333332 | 0 |
| 0.7465277777777778 | 0 |
| 0.7472222222222222 | 0 |
| 0.7479166666666667 | 0 |
| 0.748611111111111 | 0 |
| 0.7493055555555556 | 0 |
| 0.75 | 0 |
| 0.7506944444444444 | 0 |
| 0.751388888888889 | 0 |
| 0.7520833333333333 | 0 |
| 0.7527777777777778 | 0 |
| 0.7534722222222222 | 0 |
| 0.7541666666666668 | 0 |
| 0.7548611111111111 | 0 |
| 0.7555555555555555 | 0 |
| 0.75625 | 0 |
| 0.7569444444444445 | 0 |
| 0.7576388888888889 | 0 |
| 0.7583333333333333 | 0 |
| 0.7590277777777777 | 0 |
| 0.7597222222222223 | 0 |
| 0.7604166666666666 | 0 |
| 0.7611111111111111 | 0 |
| 0.7618055555555556 | 0 |
| 0.7625000000000001 | 0 |
| 0.7631944444444444 | 0 |
| 0.7638888888888888 | 0 |
| 0.7645833333333334 | 0 |
| 0.7652777777777778 | 0 |
| 0.7659722222222222 | 0 |
| 0.7666666666666666 | 0 |
| 0.7673611111111112 | 0 |
| 0.7680555555555556 | 0 |
| 0.7687499999999999 | 0 |
| 0.7694444444444444 | 0 |
| 0.7701388888888889 | 0 |
| 0.7708333333333334 | 0 |
| 0.7715277777777777 | 0 |
| 0.7722222222222223 | 0 |
| 0.7729166666666667 | 0 |
| 0.7736111111111111 | 0 |
| 0.7743055555555555 | 0 |
| 0.775 | 0 |
| 0.7756944444444445 | 0 |
| 0.7763888888888889 | 0 |
| 0.7770833333333332 | 0 |
| 0.7777777777777778 | 0 |
| 0.7784722222222222 | 0 |
| 0.7791666666666667 | 0 |
| 0.779861111111111 | 0 |
| 0.7805555555555556 | 0 |
| 0.78125 | 0 |
| 0.7819444444444444 | 0 |
| 0.782638888888889 | 0 |
| 0.7833333333333333 | 0 |
| 0.7840277777777778 | 0 |
| 0.7847222222222222 | 0 |
| 0.7854166666666668 | 0 |
| 0.7861111111111111 | 0 |
| 0.7868055555555555 | 0 |
| 0.7875 | 0 |
| 0.7881944444444445 | 0 |
| 0.7888888888888889 | 0 |
| 0.7895833333333333 | 0 |
| 0.7902777777777777 | 0 |
| 0.7909722222222223 | 0 |
| 0.7916666666666666 | 0 |
| 0.7923611111111111 | 0 |
| 0.7930555555555556 | 0 |
| 0.7937500000000001 | 0 |
| 0.7944444444444444 | 0 |
| 0.7951388888888888 | 0 |
| 0.7958333333333334 | 0 |
| 0.7965277777777778 | 0 |
| 0.7972222222222222 | 0 |
| 0.7979166666666666 | 0 |
| 0.7986111111111112 | 0 |
| 0.7993055555555556 | 0 |
| 0.7999999999999999 | 0 |
| 0.8006944444444444 | 0 |
| 0.8013888888888889 | 0 |
| 0.8020833333333334 | 0 |
| 0.8027777777777777 | 0 |
| 0.8034722222222223 | 0 |
| 0.8041666666666667 | 0 |
| 0.8048611111111111 | 0 |
| 0.8055555555555555 | 0 |
| 0.80625 | 0 |
| 0.8069444444444445 | 0 |
| 0.8076388888888889 | 0 |
| 0.8083333333333332 | 0 |
| 0.8090277777777778 | 0 |
| 0.8097222222222222 | 0 |
| 0.8104166666666667 | 0 |
| 0.811111111111111 | 0 |
| 0.8118055555555556 | 0 |
| 0.8125 | 0 |
| 0.8131944444444444 | 0 |
| 0.813888888888889 | 0 |
| 0.8145833333333333 | 0 |
| 0.8152777777777778 | 0 |
| 0.8159722222222222 | 0 |
| 0.8166666666666668 | 0 |
| 0.8173611111111111 | 0 |
| 0.8180555555555555 | 0 |
| 0.81875 | 0 |
| 0.8194444444444445 | 0 |
| 0.8201388888888889 | 0 |
| 0.8208333333333333 | 0 |
| 0.8215277777777777 | 0 |
| 0.8222222222222223 | 0 |
| 0.8229166666666666 | 0 |
| 0.8236111111111111 | 0 |
| 0.8243055555555556 | 0 |
| 0.8250000000000001 | 0 |
| 0.8256944444444444 | 0 |
| 0.8263888888888888 | 0 |
| 0.8270833333333334 | 0 |
| 0.8277777777777778 | 0 |
| 0.8284722222222222 | 0 |
| 0.8291666666666666 | 0 |
| 0.8298611111111112 | 0 |
| 0.8305555555555556 | 0 |
| 0.8312499999999999 | 0 |
| 0.8319444444444444 | 0 |
| 0.8326388888888889 | 0 |
| 0.8333333333333334 | 0 |
| 0.8340277777777777 | 0 |
| 0.8347222222222223 | 0 |
| 0.8354166666666667 | 0 |
| 0.8361111111111111 | 0 |
| 0.8368055555555555 | 0 |
| 0.8375 | 0 |
| 0.8381944444444445 | 0 |
| 0.8388888888888889 | 0 |
| 0.8395833333333332 | 0 |
| 0.8402777777777778 | 0 |
| 0.8409722222222222 | 0 |
| 0.8416666666666667 | 0 |
| 0.842361111111111 | 0 |
| 0.8430555555555556 | 0 |
| 0.84375 | 0 |
| 0.8444444444444444 | 0 |
| 0.845138888888889 | 0 |
| 0.8458333333333333 | 0 |
| 0.8465277777777778 | 0 |
| 0.8472222222222222 | 0 |
| 0.8479166666666668 | 0 |
| 0.8486111111111111 | 0 |
| 0.8493055555555555 | 0 |
| 0.85 | 0 |
| 0.8506944444444445 | 0 |
| 0.8513888888888889 | 0 |
| 0.8520833333333333 | 0 |
| 0.8527777777777777 | 0 |
| 0.8534722222222223 | 0 |
| 0.8541666666666666 | 0 |
| 0.8548611111111111 | 0 |
| 0.8555555555555556 | 0 |
| 0.8562500000000001 | 0 |
| 0.8569444444444444 | 0 |
| 0.8576388888888888 | 0 |
| 0.8583333333333334 | 0 |
| 0.8590277777777778 | 0 |
| 0.8597222222222222 | 0 |
| 0.8604166666666666 | 0 |
| 0.8611111111111112 | 0 |
| 0.8618055555555556 | 0 |
| 0.8624999999999999 | 0 |
| 0.8631944444444444 | 0 |
| 0.8638888888888889 | 0 |
| 0.8645833333333334 | 0 |
| 0.8652777777777777 | 0 |
| 0.8659722222222223 | 0 |
| 0.8666666666666667 | 0 |
| 0.8673611111111111 | 0 |
| 0.8680555555555555 | 0 |
| 0.86875 | 0 |
| 0.8694444444444445 | 0 |
| 0.8701388888888889 | 0 |
| 0.8708333333333332 | 0 |
| 0.8715277777777778 | 0 |
| 0.8722222222222222 | 0 |
| 0.8729166666666667 | 0 |
| 0.873611111111111 | 0 |
| 0.8743055555555556 | 0 |
| 0.875 | 0 |
| 0.8756944444444444 | 0 |
| 0.876388888888889 | 0 |
| 0.8770833333333333 | 0 |
| 0.8777777777777778 | 0 |
| 0.8784722222222222 | 0 |
| 0.8791666666666668 | 0 |
| 0.8798611111111111 | 0 |
| 0.8805555555555555 | 0 |
| 0.88125 | 0 |
| 0.8819444444444445 | 0 |
| 0.8826388888888889 | 0 |
| 0.8833333333333333 | 0 |
| 0.8840277777777777 | 0 |
| 0.8847222222222223 | 0 |
| 0.8854166666666666 | 0 |
| 0.8861111111111111 | 0 |
| 0.8868055555555556 | 0 |
| 0.8875000000000001 | 0 |
| 0.8881944444444444 | 0 |
| 0.8888888888888888 | 0 |
| 0.8895833333333334 | 0 |
| 0.8902777777777778 | 0 |
| 0.8909722222222222 | 0 |
| 0.8916666666666666 | 0 |
| 0.8923611111111112 | 0 |
| 0.8930555555555556 | 0 |
| 0.8937499999999999 | 0 |
| 0.8944444444444444 | 0 |
| 0.8951388888888889 | 0 |
| 0.8958333333333334 | 0 |
| 0.8965277777777777 | 0 |
| 0.8972222222222223 | 0 |
| 0.8979166666666667 | 0 |
| 0.8986111111111111 | 0 |
| 0.8993055555555555 | 0 |
| 0.9 | 0 |
| 0.9006944444444445 | 0 |
| 0.9013888888888889 | 0 |
| 0.9020833333333332 | 0 |
| 0.9027777777777778 | 0 |
| 0.9034722222222222 | 0 |
| 0.9041666666666667 | 0 |
| 0.904861111111111 | 0 |
| 0.9055555555555556 | 0 |
| 0.90625 | 0 |
| 0.9069444444444444 | 0 |
| 0.907638888888889 | 0 |
| 0.9083333333333333 | 0 |
| 0.9090277777777778 | 0 |
| 0.9097222222222222 | 0 |
| 0.9104166666666668 | 0 |
| 0.9111111111111111 | 0 |
| 0.9118055555555555 | 0 |
| 0.9125 | 0 |
| 0.9131944444444445 | 0 |
| 0.9138888888888889 | 0 |
| 0.9145833333333333 | 0 |
| 0.9152777777777777 | 0 |
| 0.9159722222222223 | 0 |
| 0.9166666666666666 | 0 |
| 0.9173611111111111 | 0 |
| 0.9180555555555556 | 0 |
| 0.9187500000000001 | 0 |
| 0.9194444444444444 | 0 |
| 0.9201388888888888 | 0 |
| 0.9208333333333334 | 0 |
| 0.9215277777777778 | 0 |
| 0.9222222222222222 | 0 |
| 0.9229166666666666 | 0 |
| 0.9236111111111112 | 0 |
| 0.9243055555555556 | 0 |
| 0.9249999999999999 | 0 |
| 0.9256944444444444 | 0 |
| 0.9263888888888889 | 0 |
| 0.9270833333333334 | 0 |
| 0.9277777777777777 | 0 |
| 0.9284722222222223 | 0 |
| 0.9291666666666667 | 0 |
| 0.9298611111111111 | 0 |
| 0.9305555555555555 | 0 |
| 0.93125 | 0 |
| 0.9319444444444445 | 0 |
| 0.9326388888888889 | 0 |
| 0.9333333333333332 | 0 |
| 0.9340277777777778 | 0 |
| 0.9347222222222222 | 0 |
| 0.9354166666666667 | 0 |
| 0.936111111111111 | 0 |
| 0.9368055555555556 | 0 |
| 0.9375 | 0 |
| 0.9381944444444444 | 0 |
| 0.938888888888889 | 0 |
| 0.9395833333333333 | 0 |
| 0.9402777777777778 | 0 |
| 0.9409722222222222 | 0 |
| 0.9416666666666668 | 0 |
| 0.9423611111111111 | 0 |
| 0.9430555555555555 | 0 |
| 0.94375 | 0 |
| 0.9444444444444445 | 0 |
| 0.9451388888888889 | 0 |
| 0.9458333333333333 | 0 |
| 0.9465277777777777 | 0 |
| 0.9472222222222223 | 0 |
| 0.9479166666666666 | 0 |
| 0.9486111111111111 | 0 |
| 0.9493055555555556 | 0 |
| 0.9500000000000001 | 0 |
| 0.9506944444444444 | 0 |
| 0.9513888888888888 | 0 |
| 0.9520833333333334 | 0 |
| 0.9527777777777778 | 0 |
| 0.9534722222222222 | 0 |
| 0.9541666666666666 | 0 |
| 0.9548611111111112 | 0 |
| 0.9555555555555556 | 0 |
| 0.9562499999999999 | 0 |
| 0.9569444444444444 | 0 |
| 0.9576388888888889 | 0 |
| 0.9583333333333334 | 0 |
| 0.9590277777777777 | 0 |
| 0.9597222222222223 | 0 |
| 0.9604166666666667 | 0 |
| 0.9611111111111111 | 0 |
| 0.9618055555555555 | 0 |
| 0.9625 | 0 |
| 0.9631944444444445 | 0 |
| 0.9638888888888889 | 0 |
| 0.9645833333333332 | 0 |
| 0.9652777777777778 | 0 |
| 0.9659722222222222 | 0 |
| 0.9666666666666667 | 0 |
| 0.967361111111111 | 0 |
| 0.9680555555555556 | 0 |
| 0.96875 | 0 |
| 0.9694444444444444 | 0 |
| 0.970138888888889 | 0 |
| 0.9708333333333333 | 0 |
| 0.9715277777777778 | 0 |
| 0.9722222222222222 | 0 |
| 0.9729166666666668 | 0 |
| 0.9736111111111111 | 0 |
| 0.9743055555555555 | 0 |
| 0.975 | 0 |
| 0.9756944444444445 | 0 |
| 0.9763888888888889 | 0 |
| 0.9770833333333333 | 0 |
| 0.9777777777777777 | 0 |
| 0.9784722222222223 | 0 |
| 0.9791666666666666 | 0 |
| 0.9798611111111111 | 0 |
| 0.9805555555555556 | 0 |
| 0.9812500000000001 | 0 |
| 0.9819444444444444 | 0 |
| 0.9826388888888888 | 0 |
| 0.9833333333333334 | 0 |
| 0.9840277777777778 | 0 |
| 0.9847222222222222 | 0 |
| 0.9854166666666666 | 0 |
| 0.9861111111111112 | 0 |
| 0.9868055555555556 | 0 |
| 0.9874999999999999 | 0 |
| 0.9881944444444444 | 0 |
| 0.9888888888888889 | 0 |
| 0.9895833333333334 | 0 |
| 0.9902777777777777 | 0 |
| 0.9909722222222223 | 0 |
| 0.9916666666666667 | 0 |
| 0.9923611111111111 | 0 |
| 0.9930555555555555 | 0 |
| 0.99375 | 0 |
| 0.9944444444444445 | 0 |
| 0.9951388888888889 | 0 |
| 0.9958333333333332 | 0 |
| 0.9965277777777778 | 0 |
| 0.9972222222222222 | 0 |
| 0.9979166666666667 | 0 |
| 0.998611111111111 | 0 |
| 0.9993055555555556 | 0 |